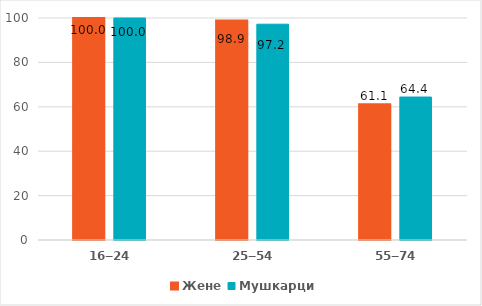
| Category | Жене | Мушкарци |
|---|---|---|
| 16‒24 | 100 | 100 |
| 25‒54 | 98.9 | 97.2 |
| 55‒74 | 61.1 | 64.4 |